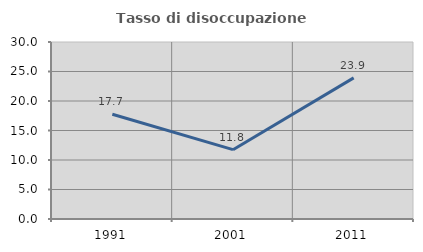
| Category | Tasso di disoccupazione giovanile  |
|---|---|
| 1991.0 | 17.745 |
| 2001.0 | 11.75 |
| 2011.0 | 23.913 |